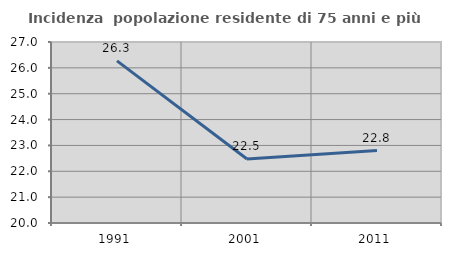
| Category | Incidenza  popolazione residente di 75 anni e più |
|---|---|
| 1991.0 | 26.269 |
| 2001.0 | 22.476 |
| 2011.0 | 22.801 |